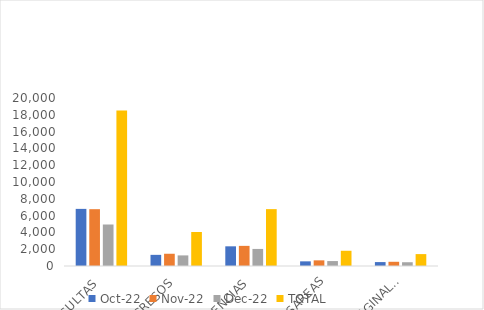
| Category | oct-22 | nov-22 | dic-22 | TOTAL |
|---|---|---|---|---|
| CONSULTAS | 6800 | 6764 | 4941 | 18505 |
| INGRESOS | 1327 | 1458 | 1262 | 4047 |
| EMERGENCIAS | 2343 | 2396 | 2032 | 6771 |
| PARTOS CESAREAS | 554 | 673 | 587 | 1814 |
| PARTOS VAGINALES | 466 | 502 | 449 | 1417 |